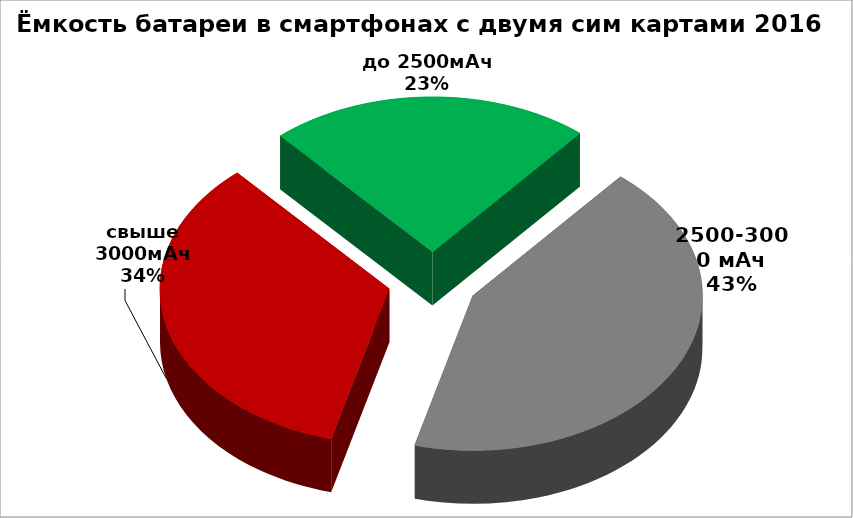
| Category | Series 0 |
|---|---|
| 2500-3000 мАч | 55 |
| свыше 3000мАч | 44 |
| до 2500мАч | 29 |